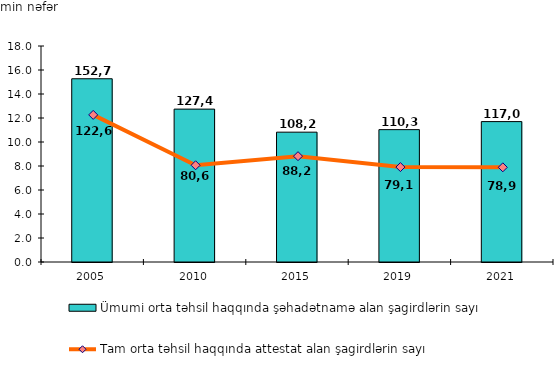
| Category | Ümumi orta təhsil haqqında şəhadətnamə alan şagirdlərin sayı                                                                    |
|---|---|
| 2005.0 | 152.7 |
| 2010.0 | 127.4 |
| 2015.0 | 108.2 |
| 2019.0 | 110.3 |
| 2021.0 | 117 |